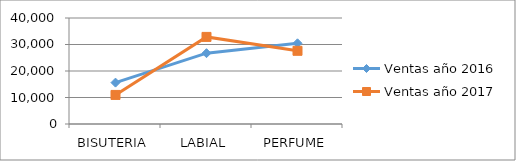
| Category | Ventas año 2016 | Ventas año 2017 |
|---|---|---|
| BISUTERIA | 15618 | 10968 |
| LABIAL | 26726 | 32870 |
| PERFUME | 30458 | 27620 |